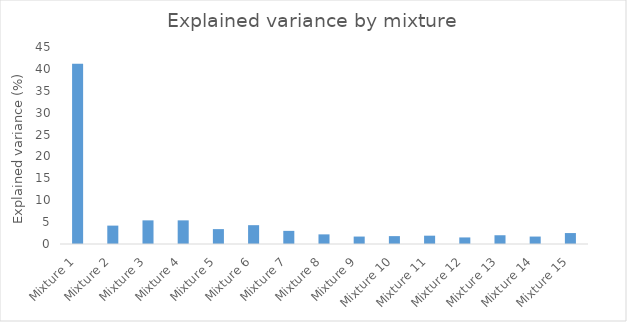
| Category | Explained variance (%) |
|---|---|
| Mixture 1 | 41.2 |
| Mixture 2 | 4.2 |
| Mixture 3 | 5.4 |
| Mixture 4 | 5.4 |
| Mixture 5 | 3.4 |
| Mixture 6 | 4.3 |
| Mixture 7 | 3 |
| Mixture 8 | 2.2 |
| Mixture 9 | 1.7 |
| Mixture 10 | 1.8 |
| Mixture 11 | 1.9 |
| Mixture 12 | 1.5 |
| Mixture 13 | 2 |
| Mixture 14 | 1.7 |
| Mixture 15 | 2.5 |